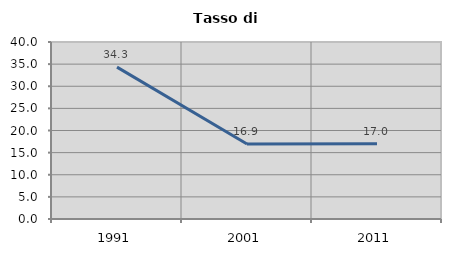
| Category | Tasso di disoccupazione   |
|---|---|
| 1991.0 | 34.32 |
| 2001.0 | 16.942 |
| 2011.0 | 17.031 |